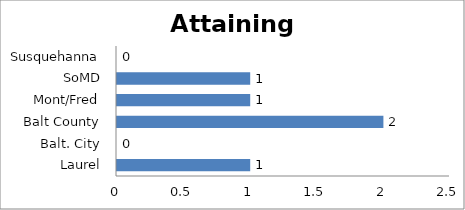
| Category | Attaining Credential |
|---|---|
| Laurel | 1 |
| Balt. City | 0 |
| Balt County | 2 |
| Mont/Fred | 1 |
| SoMD | 1 |
| Susquehanna | 0 |